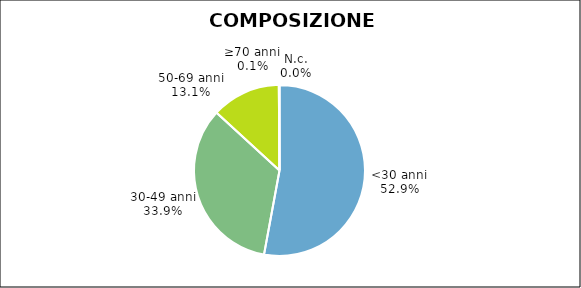
| Category | Series 0 |
|---|---|
| <30 anni | 10580 |
| 30-49 anni | 6785 |
| 50-69 anni | 2609 |
| ≥70 anni | 18 |
| N.c. | 8 |